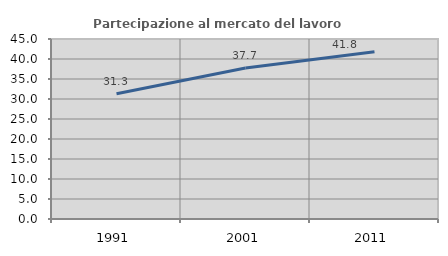
| Category | Partecipazione al mercato del lavoro  femminile |
|---|---|
| 1991.0 | 31.313 |
| 2001.0 | 37.727 |
| 2011.0 | 41.812 |